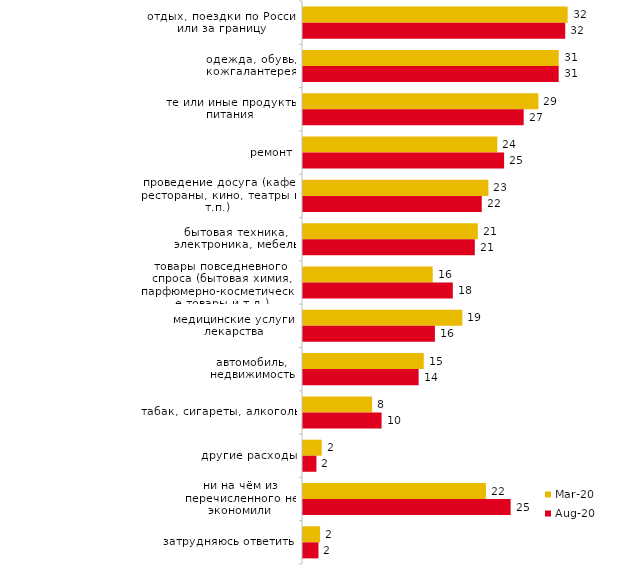
| Category | мар.20 | авг.20 |
|---|---|---|
| отдых, поездки по России или за границу | 32.276 | 31.976 |
| одежда, обувь, кожгалантерея | 31.185 | 31.182 |
| те или иные продукты питания | 28.706 | 26.912 |
| ремонт | 23.699 | 24.528 |
| проведение досуга (кафе, рестораны, кино, театры и т.п.) | 22.608 | 21.797 |
| бытовая техника, электроника, мебель | 21.319 | 20.953 |
| товары повседневного спроса (бытовая химия, парфюмерно-косметические товары и т.д.) | 15.816 | 18.272 |
| медицинские услуги, лекарства | 19.435 | 16.087 |
| автомобиль, недвижимость | 14.725 | 14.101 |
| табак, сигареты, алкоголь | 8.428 | 9.583 |
| другие расходы | 2.281 | 1.639 |
| ни на чём из перечисленного не экономили | 22.31 | 25.323 |
| затрудняюсь ответить | 2.082 | 1.887 |